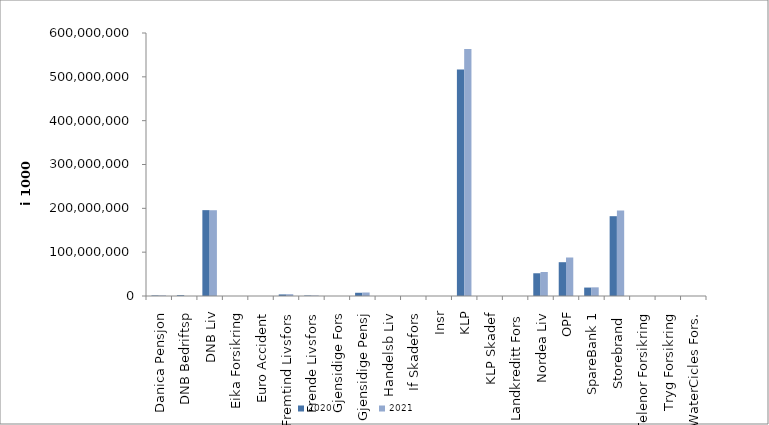
| Category | 2020 | 2021 |
|---|---|---|
| Danica Pensjon | 1259550.713 | 1358359.769 |
| DNB Bedriftsp | 1786281 | 0 |
| DNB Liv | 195862400 | 195668621.746 |
| Eika Forsikring | 0 | 0 |
| Euro Accident | 0 | 0 |
| Fremtind Livsfors | 3587824.385 | 4079532.452 |
| Frende Livsfors | 1132352 | 1134700 |
| Gjensidige Fors | 0 | 0 |
| Gjensidige Pensj | 7375058.8 | 7988385 |
| Handelsb Liv | 24707.773 | 20421.387 |
| If Skadefors | 0 | 0 |
| Insr | 0 | 0 |
| KLP | 516931786.696 | 563636708.307 |
| KLP Skadef | 45976.864 | 67448.82 |
| Landkreditt Fors | 0 | 0 |
| Nordea Liv | 51856098.771 | 54800660 |
| OPF | 77112000 | 87821000 |
| SpareBank 1 | 19251355.336 | 19758215.866 |
| Storebrand  | 182079379.465 | 195179233.263 |
| Telenor Forsikring | 0 | 0 |
| Tryg Forsikring | 0 | 0 |
| WaterCicles Fors. | 0 | 0 |